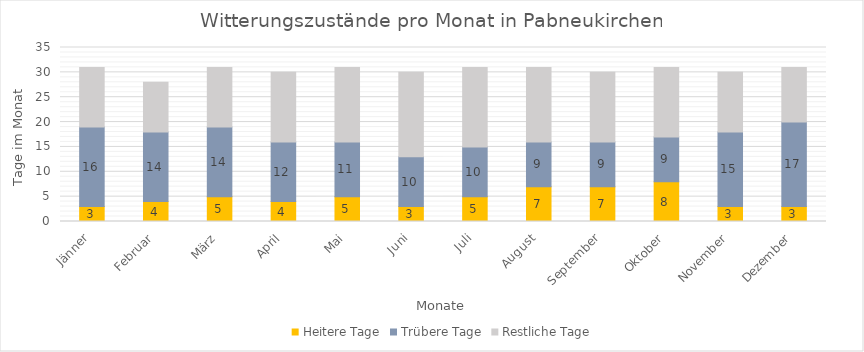
| Category | Heitere Tage | Trübere Tage | Restliche Tage |
|---|---|---|---|
| Jänner | 3 | 16 | 12 |
| Februar | 4 | 14 | 10 |
| März | 5 | 14 | 12 |
| April | 4 | 12 | 14 |
| Mai | 5 | 11 | 15 |
| Juni | 3 | 10 | 17 |
| Juli | 5 | 10 | 16 |
| August | 7 | 9 | 15 |
| September | 7 | 9 | 14 |
| Oktober | 8 | 9 | 14 |
| November | 3 | 15 | 12 |
| Dezember | 3 | 17 | 11 |